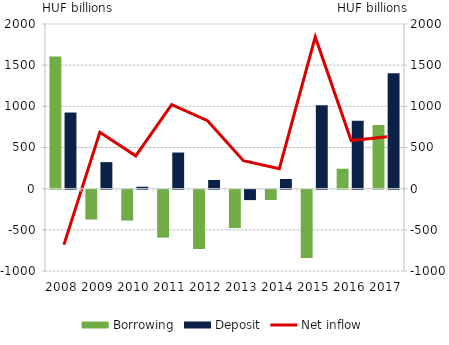
| Category | Borrowing | Deposit |
|---|---|---|
| 2008.0 | 1604.117 | 924.526 |
| 2009.0 | -363.024 | 322.449 |
| 2010.0 | -375.15 | 23.517 |
| 2011.0 | -582.414 | 439.017 |
| 2012.0 | -720.502 | 104.961 |
| 2013.0 | -466.305 | -126.817 |
| 2014.0 | -125.073 | 117.279 |
| 2015.0 | -830.803 | 1012.037 |
| 2016.0 | 241.811 | 825.492 |
| 2017.0 | 773.189 | 1402.796 |